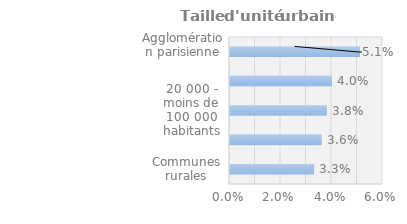
| Category | Series 0 |
|---|---|
| Communes rurales | 0.033 |
| 100 000 habitants ou plus | 0.036 |
| 20 000 - moins de 100 000 habitants | 0.038 |
| Moins de 20 000 habitants | 0.04 |
| Agglomération parisienne | 0.051 |